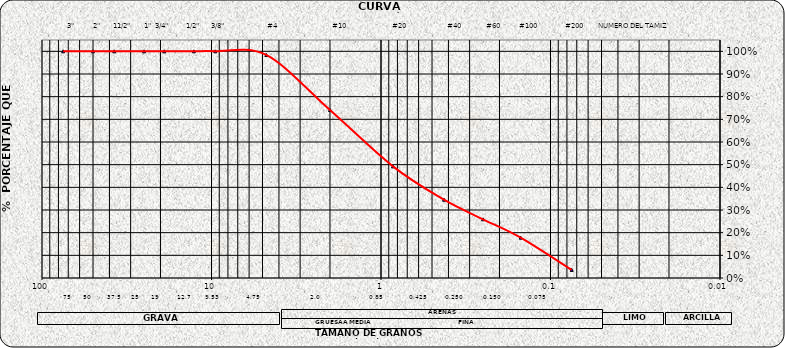
| Category | Series 0 |
|---|---|
| 75.0 | 1 |
| 50.0 | 1 |
| 37.5 | 1 |
| 25.0 | 1 |
| 19.0 | 1 |
| 12.7 | 1 |
| 9.5 | 1 |
| 4.75 | 0.984 |
| 2.0 | 0.741 |
| 0.85 | 0.492 |
| 0.425 | 0.345 |
| 0.25 | 0.259 |
| 0.15 | 0.178 |
| 0.075 | 0.036 |
| nan | 0 |